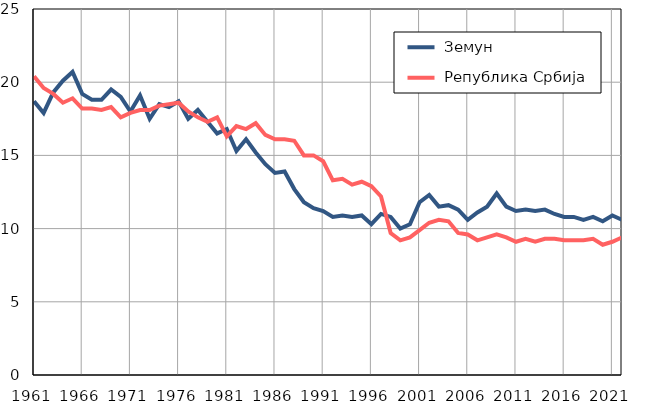
| Category |  Земун |  Република Србија |
|---|---|---|
| 1961.0 | 18.7 | 20.4 |
| 1962.0 | 17.9 | 19.6 |
| 1963.0 | 19.3 | 19.2 |
| 1964.0 | 20.1 | 18.6 |
| 1965.0 | 20.7 | 18.9 |
| 1966.0 | 19.2 | 18.2 |
| 1967.0 | 18.8 | 18.2 |
| 1968.0 | 18.8 | 18.1 |
| 1969.0 | 19.5 | 18.3 |
| 1970.0 | 19 | 17.6 |
| 1971.0 | 18 | 17.9 |
| 1972.0 | 19.1 | 18.1 |
| 1973.0 | 17.5 | 18.1 |
| 1974.0 | 18.5 | 18.4 |
| 1975.0 | 18.3 | 18.5 |
| 1976.0 | 18.7 | 18.6 |
| 1977.0 | 17.5 | 18 |
| 1978.0 | 18.1 | 17.6 |
| 1979.0 | 17.3 | 17.3 |
| 1980.0 | 16.5 | 17.6 |
| 1981.0 | 16.8 | 16.3 |
| 1982.0 | 15.3 | 17 |
| 1983.0 | 16.1 | 16.8 |
| 1984.0 | 15.2 | 17.2 |
| 1985.0 | 14.4 | 16.4 |
| 1986.0 | 13.8 | 16.1 |
| 1987.0 | 13.9 | 16.1 |
| 1988.0 | 12.7 | 16 |
| 1989.0 | 11.8 | 15 |
| 1990.0 | 11.4 | 15 |
| 1991.0 | 11.2 | 14.6 |
| 1992.0 | 10.8 | 13.3 |
| 1993.0 | 10.9 | 13.4 |
| 1994.0 | 10.8 | 13 |
| 1995.0 | 10.9 | 13.2 |
| 1996.0 | 10.3 | 12.9 |
| 1997.0 | 11 | 12.2 |
| 1998.0 | 10.8 | 9.7 |
| 1999.0 | 10 | 9.2 |
| 2000.0 | 10.3 | 9.4 |
| 2001.0 | 11.8 | 9.9 |
| 2002.0 | 12.3 | 10.4 |
| 2003.0 | 11.5 | 10.6 |
| 2004.0 | 11.6 | 10.5 |
| 2005.0 | 11.3 | 9.7 |
| 2006.0 | 10.6 | 9.6 |
| 2007.0 | 11.1 | 9.2 |
| 2008.0 | 11.5 | 9.4 |
| 2009.0 | 12.4 | 9.6 |
| 2010.0 | 11.5 | 9.4 |
| 2011.0 | 11.2 | 9.1 |
| 2012.0 | 11.3 | 9.3 |
| 2013.0 | 11.2 | 9.1 |
| 2014.0 | 11.3 | 9.3 |
| 2015.0 | 11 | 9.3 |
| 2016.0 | 10.8 | 9.2 |
| 2017.0 | 10.8 | 9.2 |
| 2018.0 | 10.6 | 9.2 |
| 2019.0 | 10.8 | 9.3 |
| 2020.0 | 10.5 | 8.9 |
| 2021.0 | 10.9 | 9.1 |
| 2022.0 | 10.6 | 9.4 |